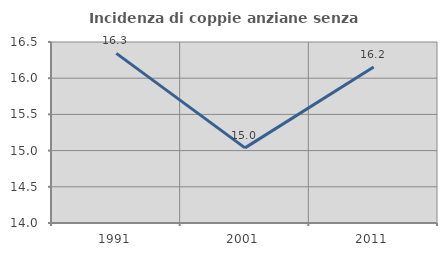
| Category | Incidenza di coppie anziane senza figli  |
|---|---|
| 1991.0 | 16.342 |
| 2001.0 | 15.038 |
| 2011.0 | 16.155 |